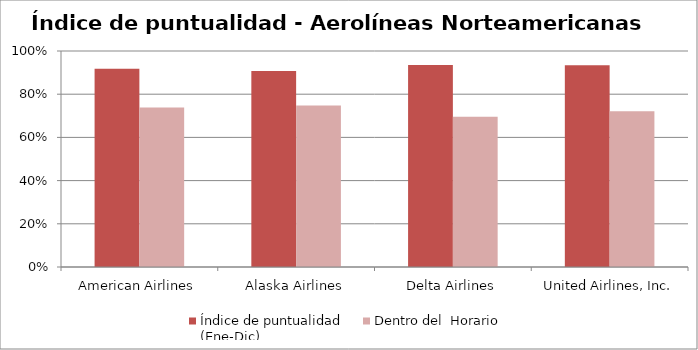
| Category | Índice de puntualidad
(Ene-Dic) | Dentro del  Horario |
|---|---|---|
| American Airlines | 0.918 | 0.738 |
| Alaska Airlines | 0.908 | 0.748 |
| Delta Airlines | 0.935 | 0.696 |
| United Airlines, Inc. | 0.934 | 0.721 |